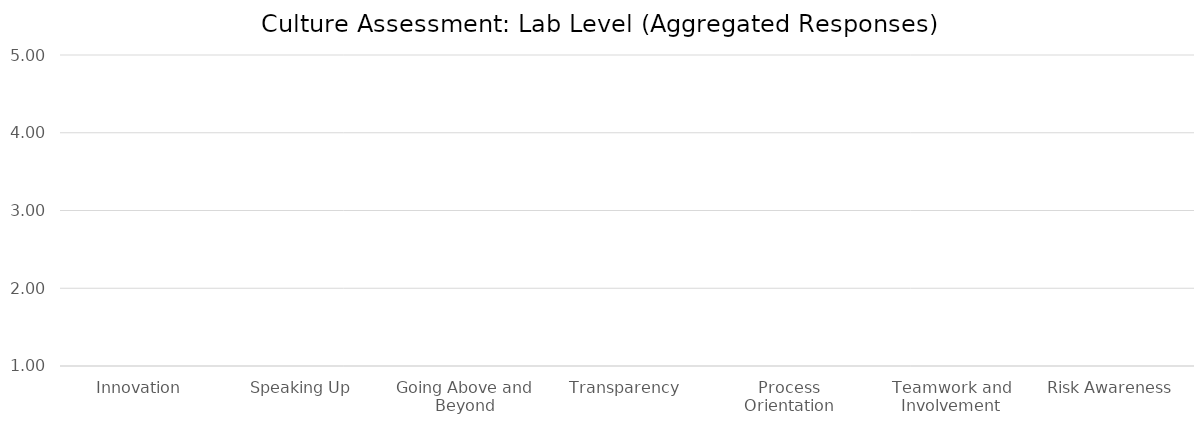
| Category | Current Culture |
|---|---|
| Innovation | 0 |
| Speaking Up | 0 |
| Going Above and Beyond | 0 |
| Transparency | 0 |
| Process Orientation | 0 |
| Teamwork and Involvement | 0 |
| Risk Awareness | 0 |